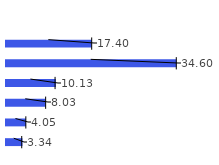
| Category | Продажи |
|---|---|
| Rubok | 3.345 |
| Babidas | 4.049 |
| Gunverse | 8.031 |
| Nuke | 10.132 |
| Asic | 34.604 |
| Galosha | 17.4 |